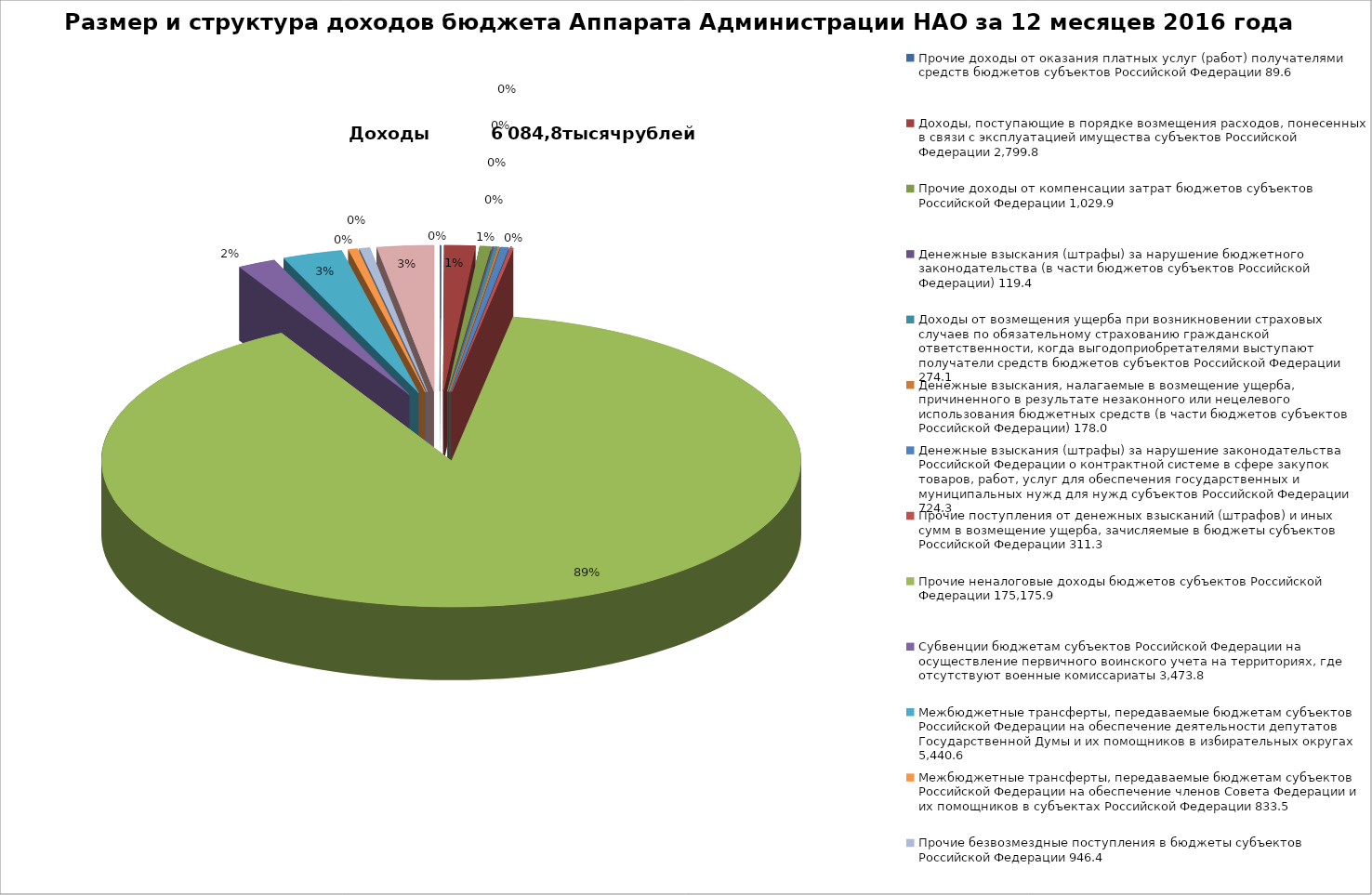
| Category | Размер и структура доходов бюджета Аппарата Администрации НАО за 9 месяцев |
|---|---|
| 0 | 89.6 |
| 1 | 2799.8 |
| 2 | 1029.9 |
| 3 | 119.4 |
| 4 | 274.1 |
| 5 | 178 |
| 6 | 724.3 |
| 7 | 311.3 |
| 8 | 175175.9 |
| 9 | 3473.8 |
| 10 | 5440.6 |
| 11 | 833.5 |
| 12 | 946.4 |
| 13 | 5163.9 |